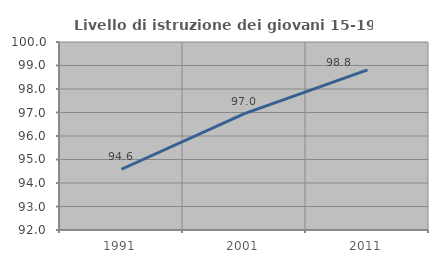
| Category | Livello di istruzione dei giovani 15-19 anni |
|---|---|
| 1991.0 | 94.585 |
| 2001.0 | 96.952 |
| 2011.0 | 98.812 |